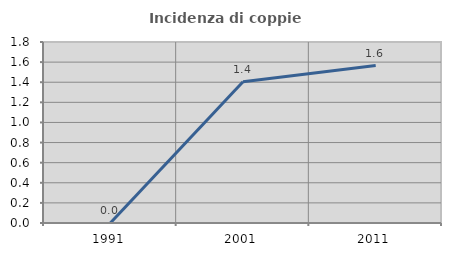
| Category | Incidenza di coppie miste |
|---|---|
| 1991.0 | 0 |
| 2001.0 | 1.406 |
| 2011.0 | 1.566 |